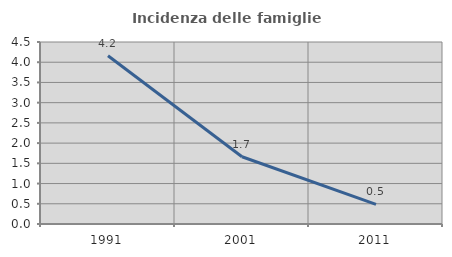
| Category | Incidenza delle famiglie numerose |
|---|---|
| 1991.0 | 4.159 |
| 2001.0 | 1.663 |
| 2011.0 | 0.485 |